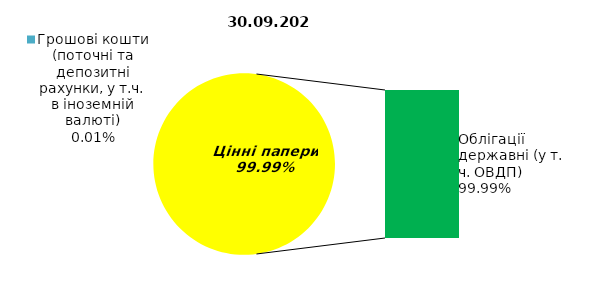
| Category | Series 0 |
|---|---|
| Грошові кошти (поточні та депозитні рахунки, у т.ч. в іноземній валюті) | 0.026 |
| Банківські метали | 0 |
| Нерухомість | 0 |
| Інші активи | 0 |
| Акції | 0 |
| Корпоративні облігації  | 0 |
| Облігації місцевих позик | 0 |
| Облігації державні (у т. ч. ОВДП) | 187.485 |
| Іпотечні сертифікати | 0 |